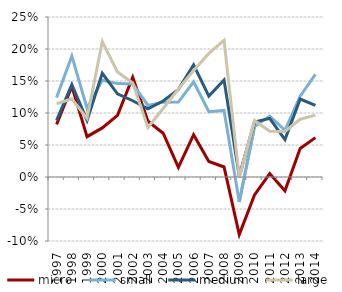
| Category | micro | small | medium | large |
|---|---|---|---|---|
| 1997.0 | 0.082 | 0.124 | 0.088 | 0.114 |
| 1998.0 | 0.142 | 0.189 | 0.144 | 0.122 |
| 1999.0 | 0.063 | 0.107 | 0.088 | 0.091 |
| 2000.0 | 0.077 | 0.151 | 0.162 | 0.212 |
| 2001.0 | 0.096 | 0.146 | 0.13 | 0.164 |
| 2002.0 | 0.156 | 0.145 | 0.119 | 0.147 |
| 2003.0 | 0.087 | 0.112 | 0.106 | 0.077 |
| 2004.0 | 0.068 | 0.117 | 0.119 | 0.107 |
| 2005.0 | 0.015 | 0.117 | 0.137 | 0.137 |
| 2006.0 | 0.066 | 0.149 | 0.175 | 0.166 |
| 2007.0 | 0.024 | 0.102 | 0.126 | 0.193 |
| 2008.0 | 0.016 | 0.104 | 0.152 | 0.214 |
| 2009.0 | -0.09 | -0.039 | 0.001 | -0.001 |
| 2010.0 | -0.028 | 0.079 | 0.086 | 0.088 |
| 2011.0 | 0.005 | 0.095 | 0.092 | 0.071 |
| 2012.0 | -0.022 | 0.073 | 0.058 | 0.071 |
| 2013.0 | 0.045 | 0.126 | 0.122 | 0.09 |
| 2014.0 | 0.062 | 0.16 | 0.112 | 0.097 |